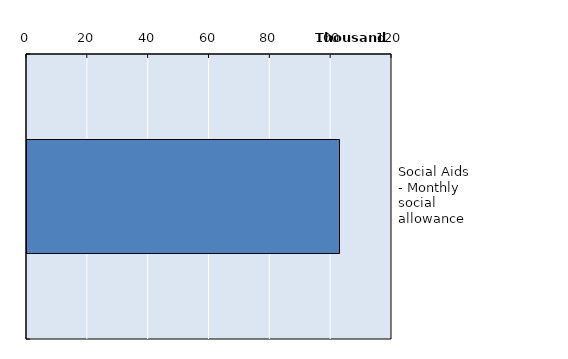
| Category | Series 0 |
|---|---|
| Social Aids - Monthly social allowance | 102744 |